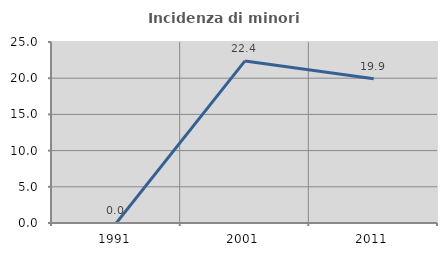
| Category | Incidenza di minori stranieri |
|---|---|
| 1991.0 | 0 |
| 2001.0 | 22.388 |
| 2011.0 | 19.936 |